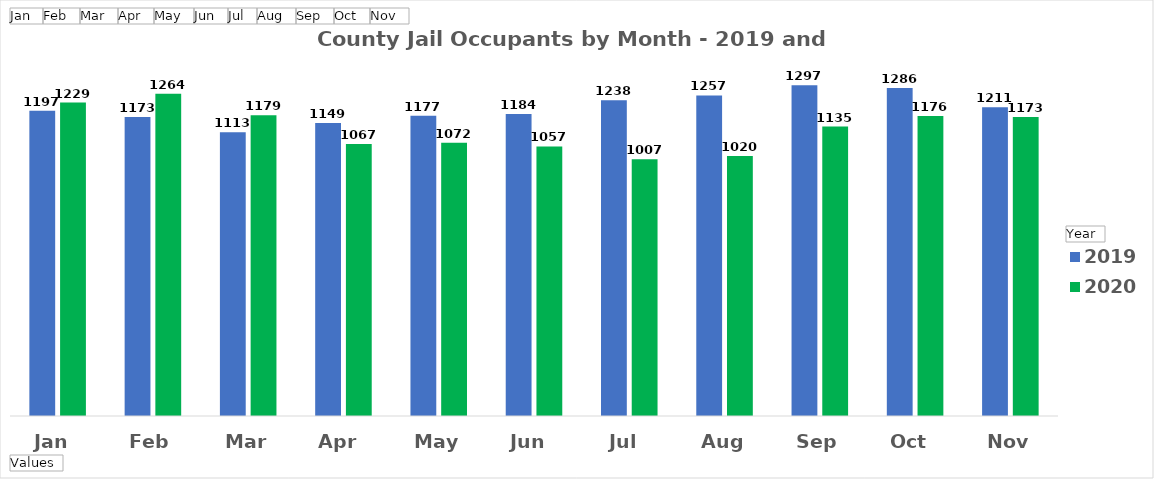
| Category | 2019 | 2020 |
|---|---|---|
| Jan  | 1197 | 1229 |
| Feb  | 1173 | 1264 |
| Mar  | 1113 | 1179 |
| Apr  | 1149 | 1067 |
| May  | 1177 | 1072 |
| Jun  | 1184 | 1057 |
| Jul  | 1238 | 1007 |
| Aug  | 1257 | 1020 |
| Sep  | 1297 | 1135 |
| Oct  | 1286 | 1176 |
| Nov  | 1211 | 1173 |